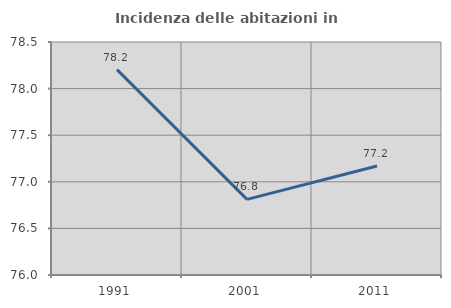
| Category | Incidenza delle abitazioni in proprietà  |
|---|---|
| 1991.0 | 78.203 |
| 2001.0 | 76.812 |
| 2011.0 | 77.169 |